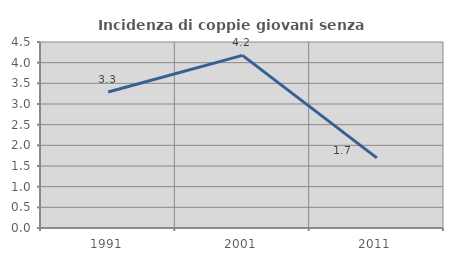
| Category | Incidenza di coppie giovani senza figli |
|---|---|
| 1991.0 | 3.292 |
| 2001.0 | 4.176 |
| 2011.0 | 1.695 |